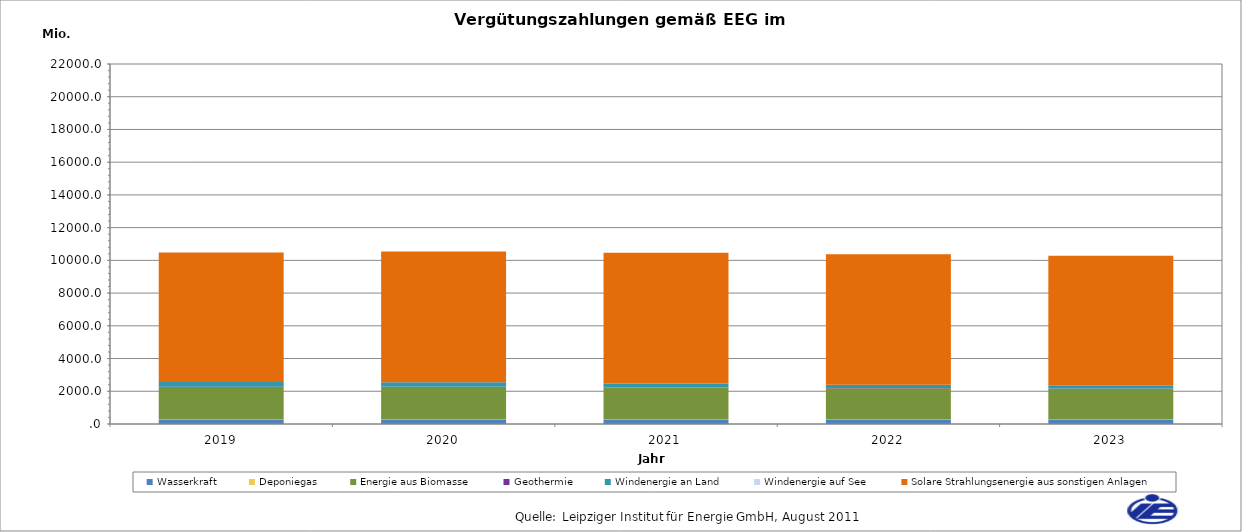
| Category | Wasserkraft | Deponiegas | Energie aus Biomasse | Geothermie | Windenergie an Land | Windenergie auf See | Solare Strahlungsenergie aus sonstigen Anlagen |
|---|---|---|---|---|---|---|---|
| 2019 | 262.257 | 11.75 | 1988.113 | 13.295 | 295.615 | 0 | 7914.194 |
| 2020 | 263.674 | 10.851 | 1994.3 | 13.331 | 276.01 | 0 | 7987.339 |
| 2021 | 263.603 | 5.529 | 1945.083 | 13.295 | 240.49 | 0 | 7998.718 |
| 2022 | 264.21 | 3.865 | 1912.387 | 13.295 | 204.007 | 0 | 7983.295 |
| 2023 | 264.815 | 3.365 | 1888.989 | 13.295 | 166.067 | 0 | 7940.529 |